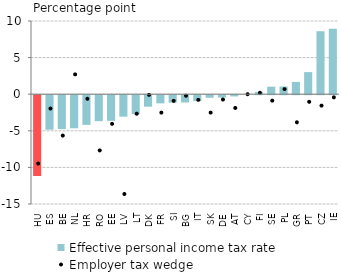
| Category | Effective personal income tax rate |
|---|---|
| HU | -11.035 |
| ES | -4.713 |
| BE | -4.629 |
| NL | -4.518 |
| HR | -4.05 |
| RO | -3.551 |
| EE | -3.5 |
| LV | -2.932 |
| LT | -2.592 |
| DK | -1.565 |
| FR | -1.114 |
| SI | -1.02 |
| BG | -0.99 |
| IT | -0.801 |
| SK | -0.348 |
| DE | -0.325 |
| AT | -0.165 |
| CY | 0 |
| FI | 0.315 |
| SE | 1.022 |
| PL | 1.049 |
| GR | 1.678 |
| PT | 3.018 |
| CZ | 8.605 |
| IE | 8.942 |